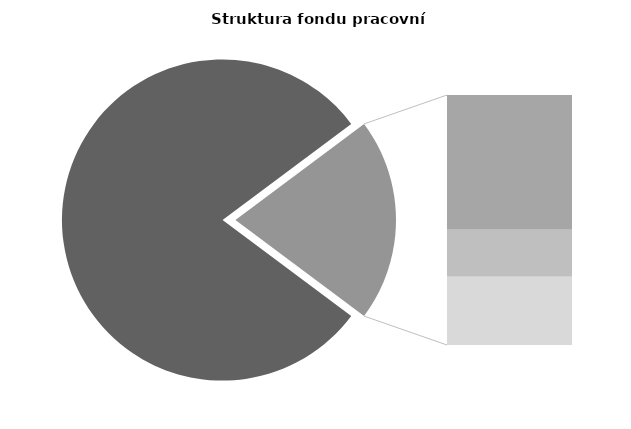
| Category | Series 0 |
|---|---|
| Průměrná měsíční 
odpracovaná doba  
bez přesčasu | 136.761 |
| Dovolená | 18.919 |
| Nemoc | 6.579 |
| Jiné | 9.591 |